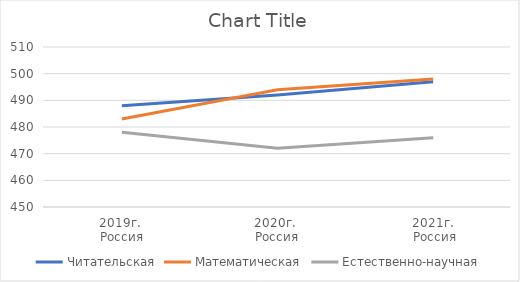
| Category | Читательская | Математическая | Естественно-научная |
|---|---|---|---|
| 2019г. 
Россия | 488 | 483 | 478 |
| 2020г. 
Россия | 492 | 494 | 472 |
| 2021г.
 Россия | 497 | 498 | 476 |